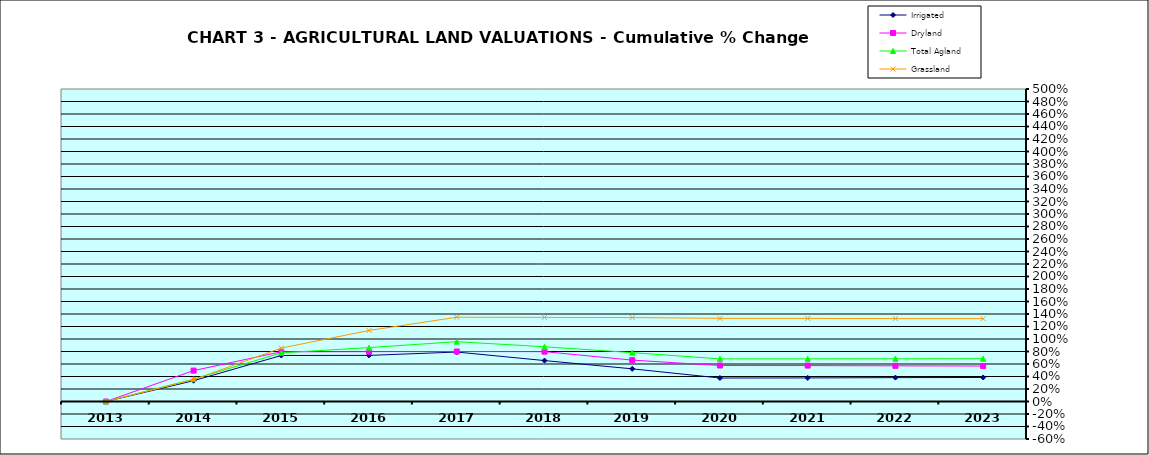
| Category | Irrigated | Dryland | Total Agland | Grassland |
|---|---|---|---|---|
| 2013.0 | 0 | 0 | 0 | 0 |
| 2014.0 | 0.333 | 0.494 | 0.357 | 0.351 |
| 2015.0 | 0.736 | 0.796 | 0.778 | 0.854 |
| 2016.0 | 0.738 | 0.798 | 0.863 | 1.136 |
| 2017.0 | 0.791 | 0.8 | 0.957 | 1.348 |
| 2018.0 | 0.655 | 0.798 | 0.876 | 1.345 |
| 2019.0 | 0.523 | 0.662 | 0.782 | 1.343 |
| 2020.0 | 0.376 | 0.576 | 0.682 | 1.331 |
| 2021.0 | 0.377 | 0.575 | 0.682 | 1.329 |
| 2022.0 | 0.382 | 0.571 | 0.684 | 1.327 |
| 2023.0 | 0.384 | 0.567 | 0.684 | 1.326 |